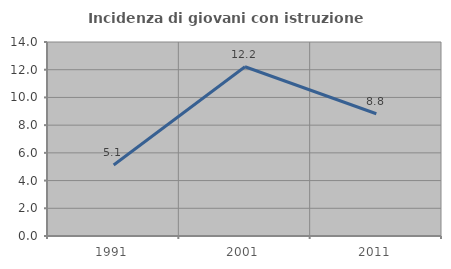
| Category | Incidenza di giovani con istruzione universitaria |
|---|---|
| 1991.0 | 5.128 |
| 2001.0 | 12.214 |
| 2011.0 | 8.824 |